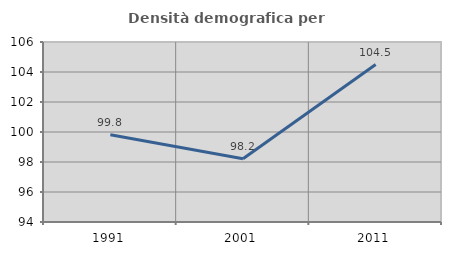
| Category | Densità demografica |
|---|---|
| 1991.0 | 99.814 |
| 2001.0 | 98.215 |
| 2011.0 | 104.498 |